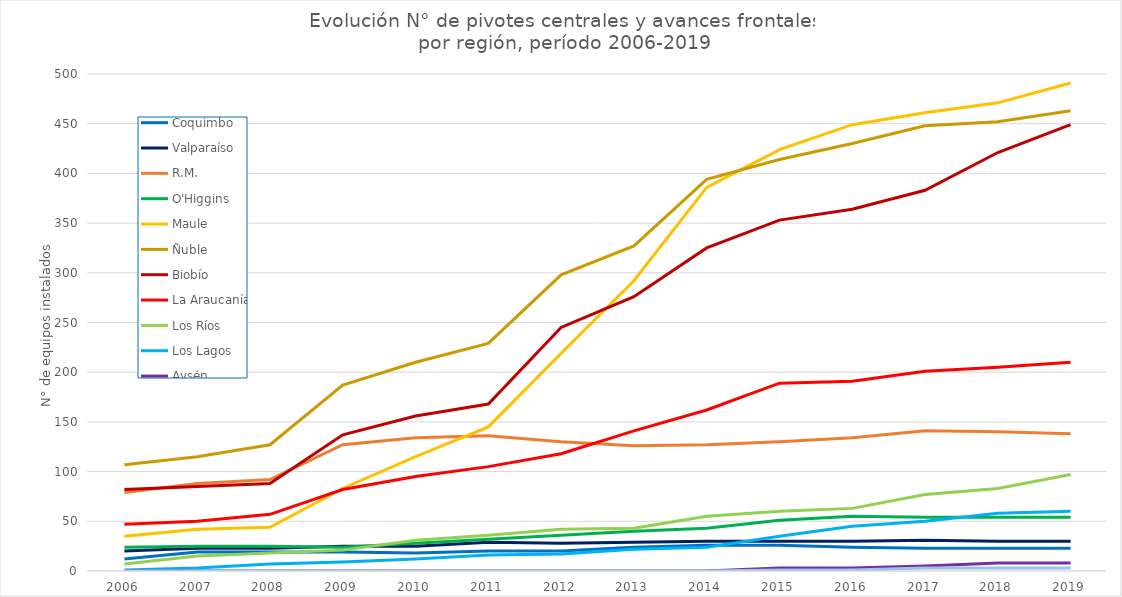
| Category | Coquimbo | Valparaíso | R.M. | O'Higgins | Maule | Ñuble | Biobío | La Araucanía | Los Ríos | Los Lagos | Aysén | Magallanes |
|---|---|---|---|---|---|---|---|---|---|---|---|---|
| 2006.0 | 12 | 20 | 79 | 24 | 35 | 107 | 82 | 47 | 7 | 1 | 0 | 0 |
| 2007.0 | 19 | 23 | 88 | 25 | 42 | 115 | 85 | 50 | 15 | 3 | 0 | 0 |
| 2008.0 | 19 | 23 | 92 | 25 | 44 | 127 | 88 | 57 | 18 | 7 | 0 | 0 |
| 2009.0 | 19 | 25 | 127 | 24 | 83 | 187 | 137 | 82 | 21 | 9 | 0 | 0 |
| 2010.0 | 18 | 25 | 134 | 28 | 115 | 210 | 156 | 95 | 31 | 12 | 0 | 0 |
| 2011.0 | 20 | 29 | 136 | 32 | 145 | 229 | 168 | 105 | 36 | 16 | 0 | 0 |
| 2012.0 | 20 | 28 | 130 | 36 | 219 | 298 | 245 | 118 | 42 | 17 | 0 | 0 |
| 2013.0 | 24 | 29 | 126 | 40 | 292 | 327 | 276 | 141 | 43 | 22 | 0 | 0 |
| 2014.0 | 26 | 30 | 127 | 43 | 386 | 394 | 325 | 162 | 55 | 24 | 0 | 0 |
| 2015.0 | 26 | 30 | 130 | 51 | 424 | 414 | 353 | 189 | 60 | 35 | 3 | 1 |
| 2016.0 | 24 | 30 | 134 | 55 | 449 | 430 | 364 | 191 | 63 | 45 | 3 | 1 |
| 2017.0 | 23 | 31 | 141 | 54 | 461 | 448 | 383 | 201 | 77 | 50 | 5 | 3 |
| 2018.0 | 23 | 30 | 140 | 54 | 471 | 452 | 421 | 205 | 83 | 58 | 8 | 3 |
| 2019.0 | 23 | 30 | 138 | 54 | 491 | 463 | 449 | 210 | 97 | 60 | 8 | 3 |